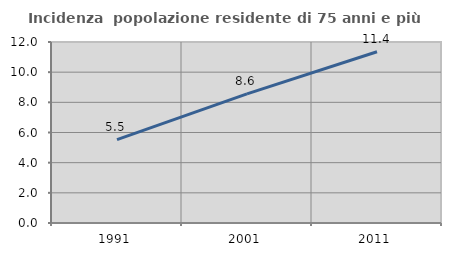
| Category | Incidenza  popolazione residente di 75 anni e più |
|---|---|
| 1991.0 | 5.532 |
| 2001.0 | 8.564 |
| 2011.0 | 11.355 |